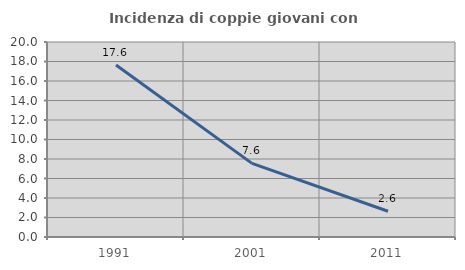
| Category | Incidenza di coppie giovani con figli |
|---|---|
| 1991.0 | 17.647 |
| 2001.0 | 7.553 |
| 2011.0 | 2.64 |